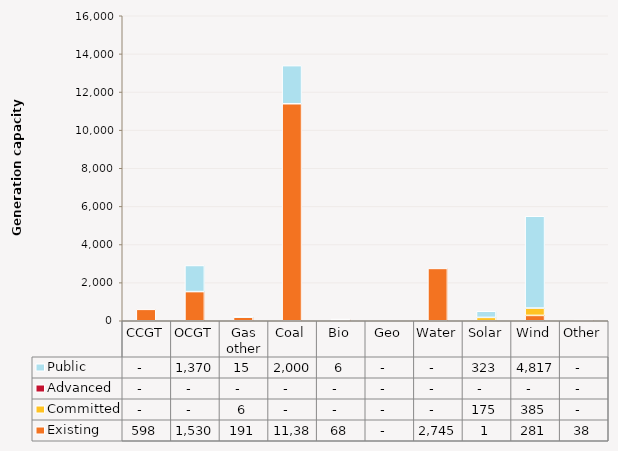
| Category | Existing | Committed | Advanced | Public |
|---|---|---|---|---|
| CCGT | 598.2 | 0 | 0 | 0 |
| OCGT | 1530 | 0 | 0 | 1370 |
| Gas other | 191.1 | 6 | 0 | 15 |
| Coal | 11383.8 | 0 | 0 | 2000 |
| Bio | 68 | 0 | 0 | 6 |
| Geo | 0 | 0 | 0 | 0 |
| Water | 2744.7 | 0 | 0 | 0 |
| Solar | 1 | 175 | 0 | 323 |
| Wind | 280.8 | 385.2 | 0 | 4816.9 |
| Other | 38.13 | 0 | 0 | 0 |